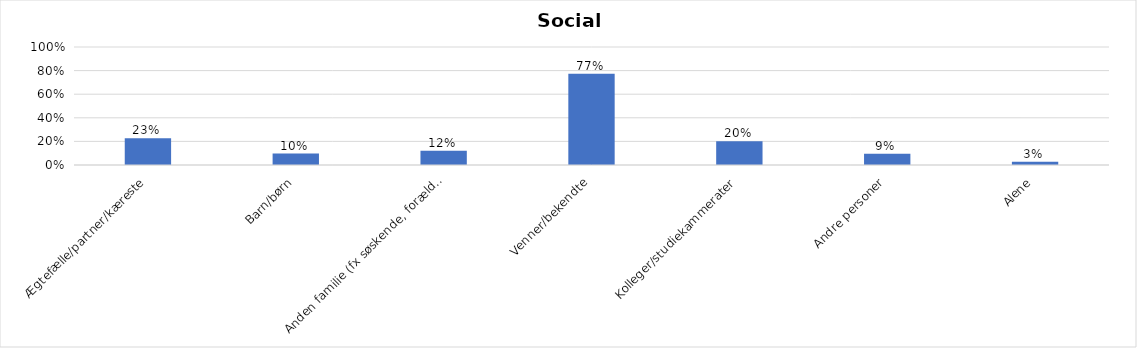
| Category | % |
|---|---|
| Ægtefælle/partner/kæreste | 0.227 |
| Barn/børn | 0.097 |
| Anden familie (fx søskende, forældre) | 0.121 |
| Venner/bekendte | 0.773 |
| Kolleger/studiekammerater | 0.201 |
| Andre personer | 0.095 |
| Alene | 0.028 |